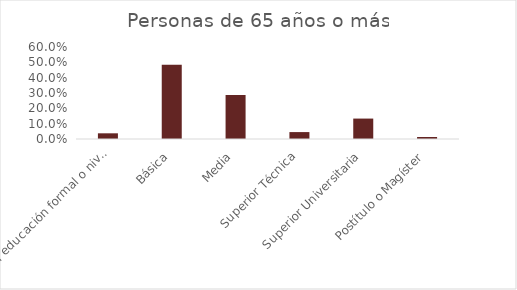
| Category | Personas de 65 años o más |
|---|---|
| Sin educación formal o nivel ignorado | 0.037 |
| Básica | 0.485 |
| Media | 0.287 |
| Superior Técnica | 0.045 |
| Superior Universitaria | 0.133 |
| Postítulo o Magíster | 0.013 |